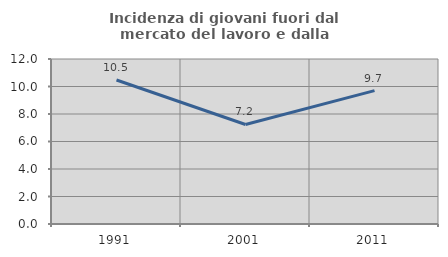
| Category | Incidenza di giovani fuori dal mercato del lavoro e dalla formazione  |
|---|---|
| 1991.0 | 10.473 |
| 2001.0 | 7.238 |
| 2011.0 | 9.697 |